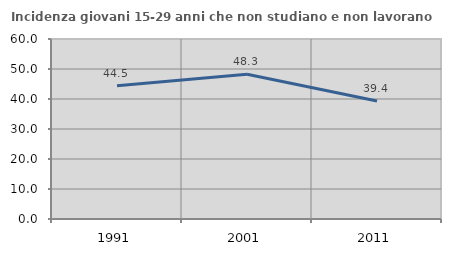
| Category | Incidenza giovani 15-29 anni che non studiano e non lavorano  |
|---|---|
| 1991.0 | 44.456 |
| 2001.0 | 48.271 |
| 2011.0 | 39.359 |